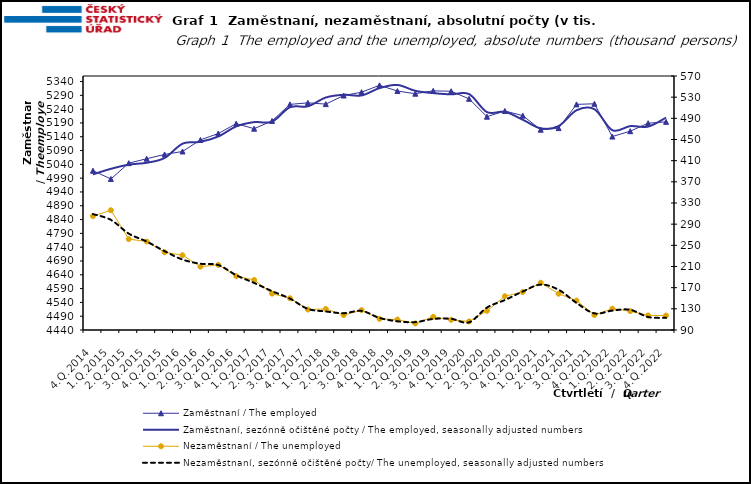
| Category | Zaměstnaní / The employed | Zaměstnaní, sezónně očištěné počty / The employed, seasonally adjusted numbers |
|---|---|---|
| 4.Q.2014 | 5017.051 | 5003.629 |
| 1.Q.2015 | 4987.141 | 5023.827 |
| 2.Q.2015 | 5044.285 | 5038.984 |
| 3.Q.2015 | 5060.3 | 5045.647 |
| 4.Q.2015 | 5075.884 | 5063.085 |
| 1.Q.2016 | 5086.671 | 5114.698 |
| 2.Q.2016 | 5128.493 | 5121.602 |
| 3.Q.2016 | 5151.712 | 5140.967 |
| 4.Q.2016 | 5187.436 | 5177.35 |
| 1.Q.2017 | 5169.203 | 5192.941 |
| 2.Q.2017 | 5197.265 | 5194.555 |
| 3.Q.2017 | 5257.26 | 5246.726 |
| 4.Q.2017 | 5262.691 | 5250.237 |
| 1.Q.2018 | 5258.225 | 5281.99 |
| 2.Q.2018 | 5289.242 | 5291.982 |
| 3.Q.2018 | 5301.361 | 5289.641 |
| 4.Q.2018 | 5326.327 | 5316.128 |
| 1.Q.2019 | 5305.534 | 5327.565 |
| 2.Q.2019 | 5295.929 | 5306.306 |
| 3.Q.2019 | 5306.247 | 5298.103 |
| 4.Q.2019 | 5304.7 | 5293.467 |
| 1.Q.2020 | 5277.418 | 5294.602 |
| 2.Q.2020 | 5212.593 | 5229.332 |
| 3.Q.2020 | 5233.335 | 5230.287 |
| 4.Q.2020 | 5216.403 | 5201.67 |
| 1.Q.2021 | 5165.582 | 5170.334 |
| 2.Q.2021 | 5171.264 | 5178.592 |
| 3.Q.2021 | 5257.199 | 5235.825 |
| 4.Q.2021 | 5259.43 | 5239.857 |
| 1.Q.2022 | 5140.696 | 5163.642 |
| 2.Q.2022 | 5160.173 | 5178.417 |
| 3.Q.2022 | 5188.945 | 5176.76 |
| 4.Q.2022 | 5193.945 | 5209.198 |